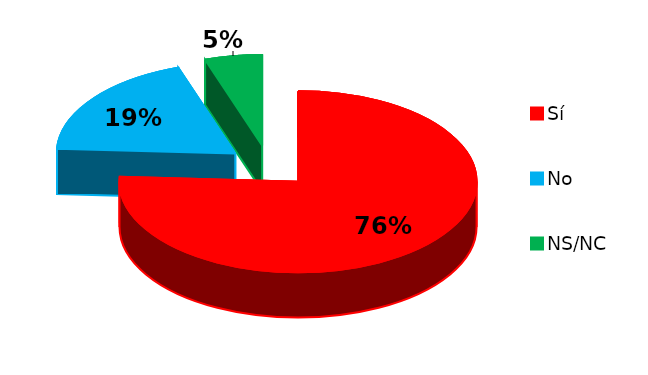
| Category | Series 0 |
|---|---|
| Sí | 88 |
| No | 22 |
| NS/NC | 6 |